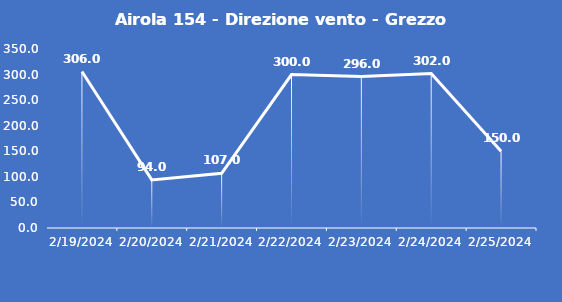
| Category | Airola 154 - Direzione vento - Grezzo (°N) |
|---|---|
| 2/19/24 | 306 |
| 2/20/24 | 94 |
| 2/21/24 | 107 |
| 2/22/24 | 300 |
| 2/23/24 | 296 |
| 2/24/24 | 302 |
| 2/25/24 | 150 |